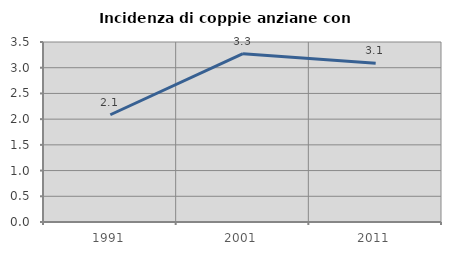
| Category | Incidenza di coppie anziane con figli |
|---|---|
| 1991.0 | 2.085 |
| 2001.0 | 3.273 |
| 2011.0 | 3.086 |